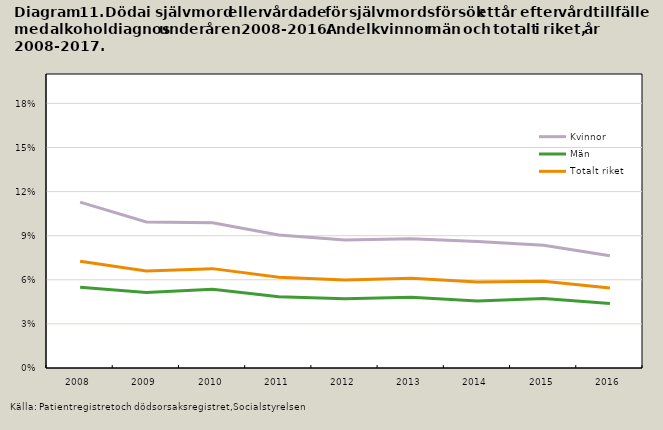
| Category | Kvinnor | Män | Totalt riket |
|---|---|---|---|
| 2008.0 | 0.113 | 0.055 | 0.073 |
| 2009.0 | 0.099 | 0.051 | 0.066 |
| 2010.0 | 0.099 | 0.054 | 0.068 |
| 2011.0 | 0.091 | 0.049 | 0.062 |
| 2012.0 | 0.087 | 0.047 | 0.06 |
| 2013.0 | 0.088 | 0.048 | 0.061 |
| 2014.0 | 0.086 | 0.046 | 0.059 |
| 2015.0 | 0.083 | 0.047 | 0.059 |
| 2016.0 | 0.076 | 0.044 | 0.054 |